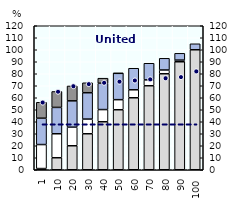
| Category | Gross earnings | Social assistance | Housing benefits | Family benefits | In-work benefits |
|---|---|---|---|---|---|
| 1.0 | 0.999 | 0 | 19.999 | 21.96 | 13.27 |
| 10.0 | 10.001 | 0 | 19.999 | 21.96 | 13.27 |
| 20.0 | 19.999 | 0 | 15.47 | 21.96 | 12.393 |
| 30.0 | 30 | 0 | 12.226 | 21.96 | 8.293 |
| 40.0 | 40.001 | 0 | 10.154 | 21.96 | 4.192 |
| 50.0 | 50.001 | 0 | 8.398 | 21.96 | 0.092 |
| 60.0 | 59.999 | 0 | 6.643 | 17.951 | 0 |
| 70.0 | 70 | 0 | 4.891 | 13.851 | 0 |
| 80.0 | 80.001 | 0 | 3.135 | 9.75 | 0 |
| 90.0 | 89.999 | 0 | 1.38 | 5.653 | 0 |
| 100.0 | 100 | 0 | 0 | 4.977 | 0 |